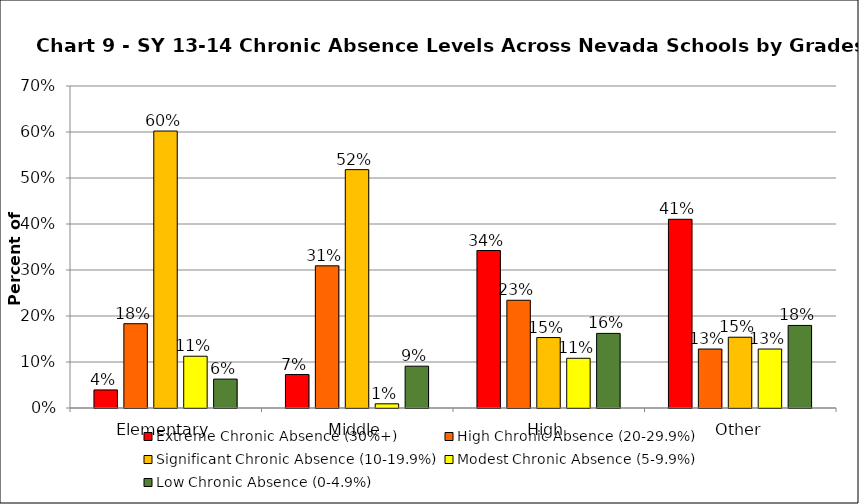
| Category | Extreme Chronic Absence (30%+) | High Chronic Absence (20-29.9%) | Significant Chronic Absence (10-19.9%) | Modest Chronic Absence (5-9.9%) | Low Chronic Absence (0-4.9%) |
|---|---|---|---|---|---|
| 0 | 0.039 | 0.183 | 0.602 | 0.113 | 0.063 |
| 1 | 0.073 | 0.309 | 0.518 | 0.009 | 0.091 |
| 2 | 0.342 | 0.234 | 0.153 | 0.108 | 0.162 |
| 3 | 0.41 | 0.128 | 0.154 | 0.128 | 0.179 |